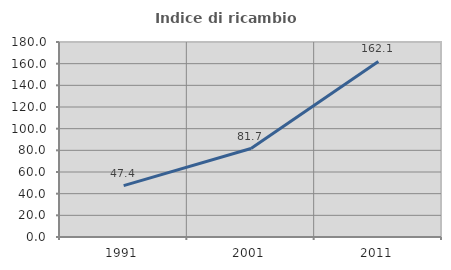
| Category | Indice di ricambio occupazionale  |
|---|---|
| 1991.0 | 47.41 |
| 2001.0 | 81.675 |
| 2011.0 | 162.069 |